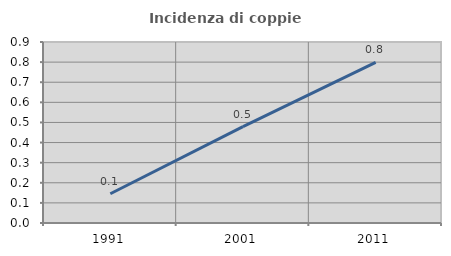
| Category | Incidenza di coppie miste |
|---|---|
| 1991.0 | 0.145 |
| 2001.0 | 0.479 |
| 2011.0 | 0.799 |